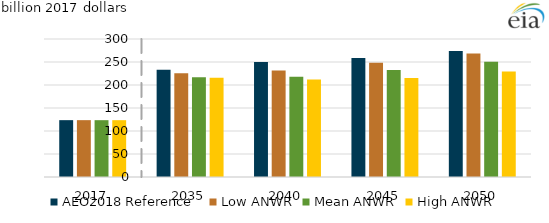
| Category | AEO2018 Reference  | Low ANWR | Mean ANWR | High ANWR |
|---|---|---|---|---|
| 2017.0 | 123.578 | 123.587 | 123.537 | 123.531 |
| 2035.0 | 232.936 | 225.722 | 216.58 | 215.952 |
| 2040.0 | 249.817 | 231.469 | 217.688 | 212.225 |
| 2045.0 | 258.901 | 248.209 | 232.399 | 215.314 |
| 2050.0 | 274.077 | 268.268 | 250.526 | 229.282 |